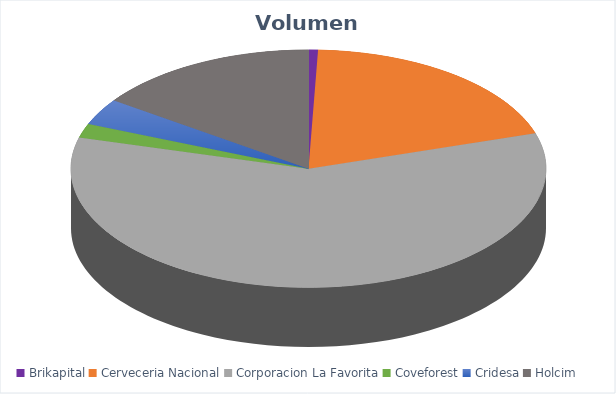
| Category | VOLUMEN ($USD) |
|---|---|
| Brikapital | 1000 |
| Cerveceria Nacional | 30460 |
| Corporacion La Favorita | 92106.47 |
| Coveforest | 3000.4 |
| Cridesa | 5591.25 |
| Holcim | 23800 |